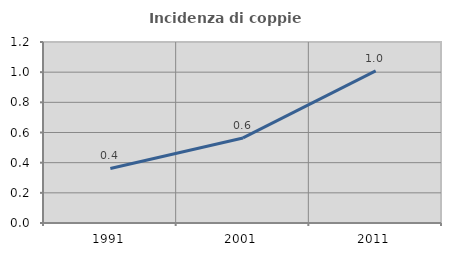
| Category | Incidenza di coppie miste |
|---|---|
| 1991.0 | 0.362 |
| 2001.0 | 0.564 |
| 2011.0 | 1.008 |